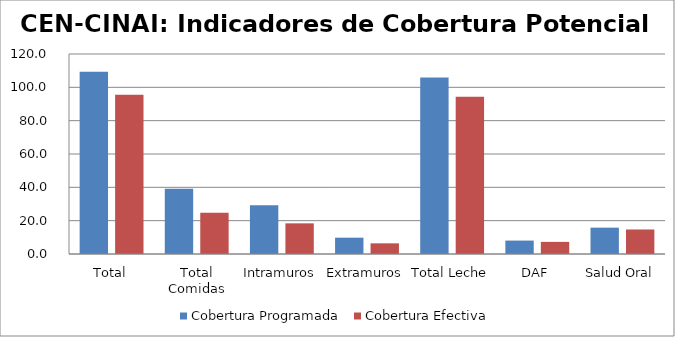
| Category | Cobertura Programada | Cobertura Efectiva |
|---|---|---|
| Total | 109.321 | 95.482 |
| Total Comidas | 39.097 | 24.798 |
| Intramuros | 29.3 | 18.4 |
| Extramuros | 9.796 | 6.398 |
| Total Leche | 105.908 | 94.408 |
| DAF | 8.05 | 7.277 |
| Salud Oral | 15.798 | 14.716 |